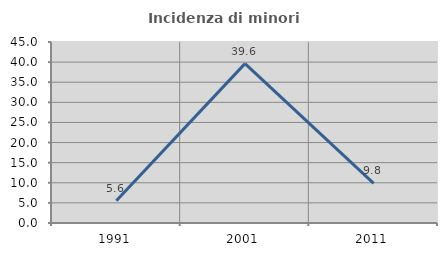
| Category | Incidenza di minori stranieri |
|---|---|
| 1991.0 | 5.556 |
| 2001.0 | 39.623 |
| 2011.0 | 9.836 |